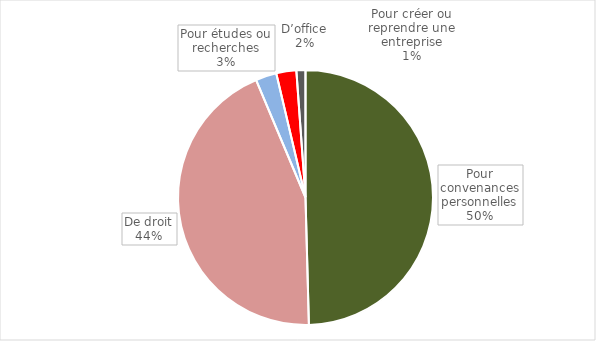
| Category | Disponibilité |
|---|---|
| Pour convenances personnelles | 0.496 |
| De droit | 0.441 |
| Pour études ou recherches | 0.027 |
| D’office | 0.025 |
| Pour créer ou reprendre une entreprise | 0.011 |